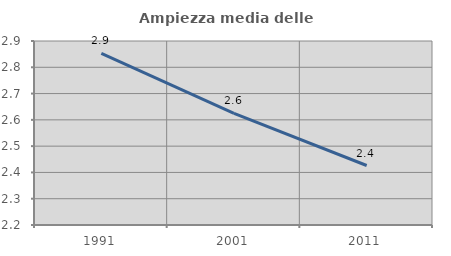
| Category | Ampiezza media delle famiglie |
|---|---|
| 1991.0 | 2.853 |
| 2001.0 | 2.624 |
| 2011.0 | 2.426 |